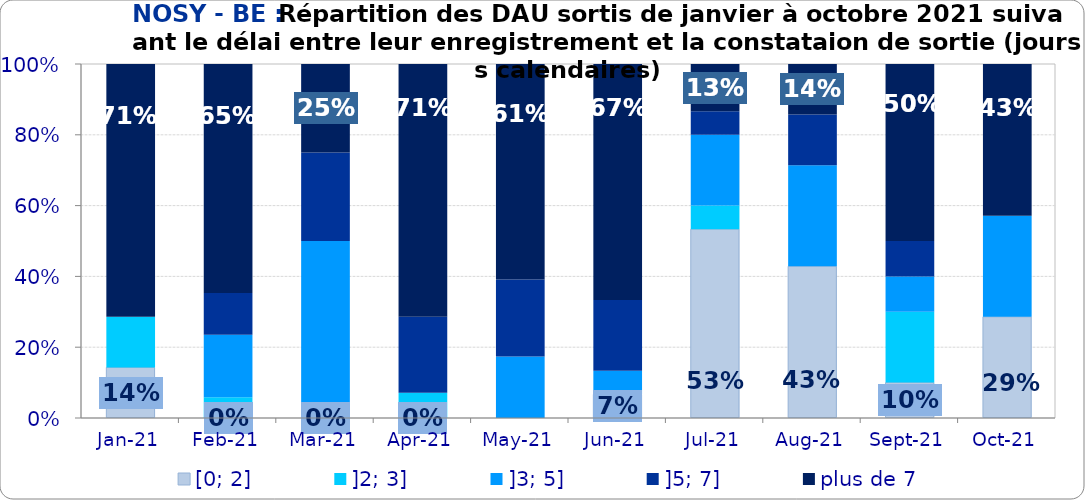
| Category | [0; 2] | ]2; 3] | ]3; 5] | ]5; 7] | plus de 7 |
|---|---|---|---|---|---|
| 2021-01-01 | 0.143 | 0.143 | 0 | 0 | 0.714 |
| 2021-02-01 | 0 | 0.059 | 0.176 | 0.118 | 0.647 |
| 2021-03-01 | 0 | 0 | 0.5 | 0.25 | 0.25 |
| 2021-04-01 | 0 | 0.071 | 0 | 0.214 | 0.714 |
| 2021-05-01 | 0 | 0 | 0.174 | 0.217 | 0.609 |
| 2021-06-01 | 0.067 | 0 | 0.067 | 0.2 | 0.667 |
| 2021-07-01 | 0.533 | 0.067 | 0.2 | 0.067 | 0.133 |
| 2021-08-01 | 0.429 | 0 | 0.286 | 0.143 | 0.143 |
| 2021-09-01 | 0.1 | 0.2 | 0.1 | 0.1 | 0.5 |
| 2021-10-01 | 0.286 | 0 | 0.286 | 0 | 0.429 |